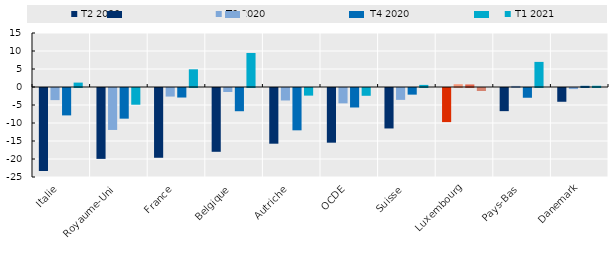
| Category | T2 2020 | T3 2020 | T4 2020 | T1 2021 |
|---|---|---|---|---|
| Italie | -23.054 | -3.364 | -7.61 | 1.224 |
| Royaume-Uni | -19.689 | -11.654 | -8.516 | -4.645 |
| France | -19.38 | -2.382 | -2.646 | 4.916 |
| Belgique | -17.722 | -1.114 | -6.451 | 9.455 |
| Autriche | -15.473 | -3.47 | -11.754 | -2.118 |
| OCDE | -15.192 | -4.264 | -5.413 | -2.164 |
| Suisse | -11.242 | -3.297 | -1.845 | 0.583 |
| Luxembourg | -9.473 | 0.772 | 0.711 | -0.838 |
| Pays-Bas | -6.43 | 0.298 | -2.707 | 6.973 |
| Danemark | -3.825 | -0.298 | 0.329 | 0.341 |